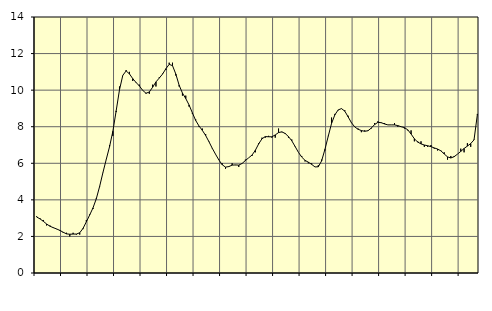
| Category | Piggar | Series 1 |
|---|---|---|
| nan | 3.1 | 3.06 |
| 87.0 | 3 | 2.96 |
| 87.0 | 2.9 | 2.83 |
| 87.0 | 2.6 | 2.68 |
| nan | 2.6 | 2.56 |
| 88.0 | 2.5 | 2.48 |
| 88.0 | 2.4 | 2.41 |
| 88.0 | 2.3 | 2.33 |
| nan | 2.2 | 2.23 |
| 89.0 | 2.2 | 2.14 |
| 89.0 | 2 | 2.12 |
| 89.0 | 2.2 | 2.13 |
| nan | 2.1 | 2.13 |
| 90.0 | 2.1 | 2.2 |
| 90.0 | 2.4 | 2.44 |
| 90.0 | 2.9 | 2.8 |
| nan | 3.2 | 3.17 |
| 91.0 | 3.5 | 3.56 |
| 91.0 | 4.1 | 4.06 |
| 91.0 | 4.7 | 4.73 |
| nan | 5.5 | 5.49 |
| 92.0 | 6.2 | 6.21 |
| 92.0 | 7 | 6.91 |
| 92.0 | 7.5 | 7.75 |
| nan | 8.8 | 8.87 |
| 93.0 | 10.2 | 10.02 |
| 93.0 | 10.8 | 10.81 |
| 93.0 | 11.1 | 11.05 |
| nan | 11 | 10.89 |
| 94.0 | 10.5 | 10.63 |
| 94.0 | 10.4 | 10.42 |
| 94.0 | 10.3 | 10.23 |
| nan | 10 | 9.99 |
| 95.0 | 9.8 | 9.83 |
| 95.0 | 9.8 | 9.9 |
| 95.0 | 10.3 | 10.16 |
| nan | 10.2 | 10.45 |
| 96.0 | 10.7 | 10.66 |
| 96.0 | 10.9 | 10.88 |
| 96.0 | 11.1 | 11.17 |
| nan | 11.5 | 11.41 |
| 97.0 | 11.5 | 11.34 |
| 97.0 | 10.8 | 10.88 |
| 97.0 | 10.2 | 10.27 |
| nan | 9.7 | 9.84 |
| 98.0 | 9.7 | 9.54 |
| 98.0 | 9.1 | 9.19 |
| 98.0 | 8.7 | 8.76 |
| nan | 8.4 | 8.34 |
| 99.0 | 8 | 8.04 |
| 99.0 | 7.9 | 7.8 |
| 99.0 | 7.6 | 7.52 |
| nan | 7.2 | 7.18 |
| 0.0 | 6.8 | 6.82 |
| 0.0 | 6.5 | 6.49 |
| 0.0 | 6.2 | 6.18 |
| nan | 6 | 5.92 |
| 1.0 | 5.7 | 5.79 |
| 1.0 | 5.8 | 5.82 |
| 1.0 | 6 | 5.9 |
| nan | 5.9 | 5.91 |
| 2.0 | 5.8 | 5.9 |
| 2.0 | 6 | 5.99 |
| 2.0 | 6.2 | 6.15 |
| nan | 6.3 | 6.3 |
| 3.0 | 6.4 | 6.45 |
| 3.0 | 6.6 | 6.71 |
| 3.0 | 7.1 | 7.06 |
| nan | 7.4 | 7.34 |
| 4.0 | 7.4 | 7.46 |
| 4.0 | 7.5 | 7.45 |
| 4.0 | 7.4 | 7.45 |
| nan | 7.4 | 7.55 |
| 5.0 | 7.9 | 7.68 |
| 5.0 | 7.7 | 7.72 |
| 5.0 | 7.6 | 7.63 |
| nan | 7.4 | 7.46 |
| 6.0 | 7.3 | 7.23 |
| 6.0 | 6.9 | 6.92 |
| 6.0 | 6.6 | 6.6 |
| nan | 6.4 | 6.34 |
| 7.0 | 6.1 | 6.16 |
| 7.0 | 6 | 6.06 |
| 7.0 | 6 | 5.94 |
| nan | 5.8 | 5.8 |
| 8.0 | 5.9 | 5.81 |
| 8.0 | 6.2 | 6.13 |
| 8.0 | 6.7 | 6.76 |
| nan | 7.5 | 7.48 |
| 9.0 | 8.5 | 8.18 |
| 9.0 | 8.7 | 8.65 |
| 9.0 | 8.9 | 8.92 |
| nan | 9 | 8.99 |
| 10.0 | 8.9 | 8.85 |
| 10.0 | 8.6 | 8.54 |
| 10.0 | 8.2 | 8.22 |
| nan | 8 | 7.99 |
| 11.0 | 7.9 | 7.86 |
| 11.0 | 7.7 | 7.79 |
| 11.0 | 7.8 | 7.75 |
| nan | 7.8 | 7.78 |
| 12.0 | 7.9 | 7.93 |
| 12.0 | 8.2 | 8.12 |
| 12.0 | 8.3 | 8.24 |
| nan | 8.2 | 8.22 |
| 13.0 | 8.2 | 8.15 |
| 13.0 | 8.1 | 8.1 |
| 13.0 | 8.1 | 8.1 |
| nan | 8.2 | 8.1 |
| 14.0 | 8 | 8.06 |
| 14.0 | 8 | 8 |
| 14.0 | 7.9 | 7.95 |
| nan | 7.8 | 7.83 |
| 15.0 | 7.8 | 7.6 |
| 15.0 | 7.2 | 7.34 |
| 15.0 | 7.2 | 7.16 |
| nan | 7.2 | 7.06 |
| 16.0 | 6.9 | 7 |
| 16.0 | 6.9 | 6.96 |
| 16.0 | 7 | 6.91 |
| nan | 6.8 | 6.84 |
| 17.0 | 6.7 | 6.78 |
| 17.0 | 6.7 | 6.68 |
| 17.0 | 6.6 | 6.51 |
| nan | 6.2 | 6.35 |
| 18.0 | 6.4 | 6.29 |
| 18.0 | 6.4 | 6.36 |
| 18.0 | 6.5 | 6.5 |
| nan | 6.8 | 6.65 |
| 19.0 | 6.6 | 6.81 |
| 19.0 | 7.1 | 6.94 |
| 19.0 | 6.9 | 7.08 |
| nan | 7.3 | 7.28 |
| 20.0 | 8.7 | 8.65 |